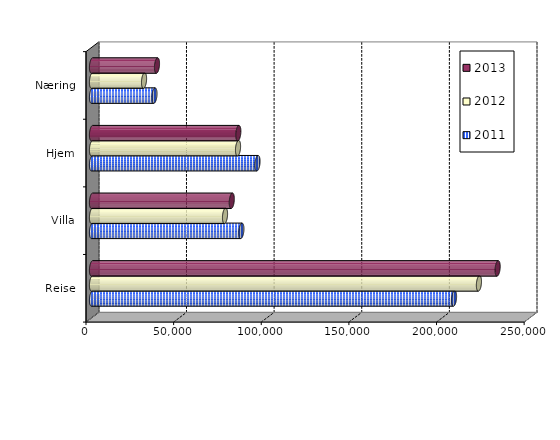
| Category | 2011 | 2012 | 2013 |
|---|---|---|---|
| Reise | 206568 | 220772.455 | 231444.567 |
| Villa | 85229 | 75898.023 | 79751 |
| Hjem | 94424 | 83319.354 | 83488 |
| Næring | 35634 | 29692.208 | 37080.469 |